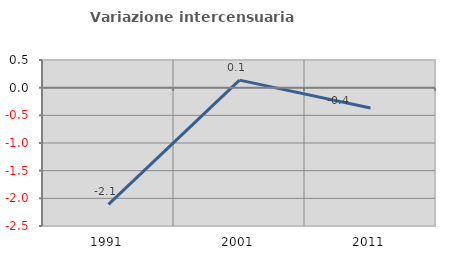
| Category | Variazione intercensuaria annua |
|---|---|
| 1991.0 | -2.108 |
| 2001.0 | 0.136 |
| 2011.0 | -0.366 |